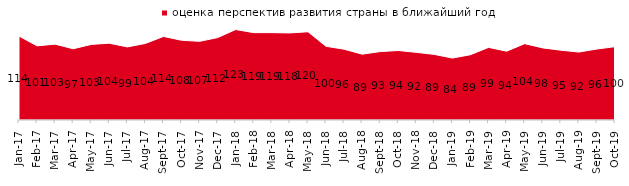
| Category | оценка перспектив развития страны в ближайший год |
|---|---|
| 2017-01-01 | 114 |
| 2017-02-01 | 100.75 |
| 2017-03-01 | 103.05 |
| 2017-04-01 | 96.75 |
| 2017-05-01 | 102.7 |
| 2017-06-01 | 104.35 |
| 2017-07-01 | 99.3 |
| 2017-08-01 | 104.05 |
| 2017-09-01 | 113.5 |
| 2017-10-01 | 108.35 |
| 2017-11-01 | 106.85 |
| 2017-12-01 | 111.95 |
| 2018-01-01 | 122.9 |
| 2018-02-01 | 118.7 |
| 2018-03-01 | 118.7 |
| 2018-04-01 | 118.3 |
| 2018-05-01 | 119.9 |
| 2018-06-01 | 100.1 |
| 2018-07-01 | 96.2 |
| 2018-08-01 | 89.45 |
| 2018-09-01 | 92.95 |
| 2018-10-01 | 94.4 |
| 2018-11-01 | 91.916 |
| 2018-12-01 | 89.05 |
| 2019-01-01 | 84.15 |
| 2019-02-01 | 88.75 |
| 2019-03-01 | 98.657 |
| 2019-04-01 | 93.515 |
| 2019-05-01 | 103.764 |
| 2019-06-01 | 97.955 |
| 2019-07-01 | 94.851 |
| 2019-08-01 | 92.308 |
| 2019-09-01 | 96.436 |
| 2019-10-01 | 99.604 |